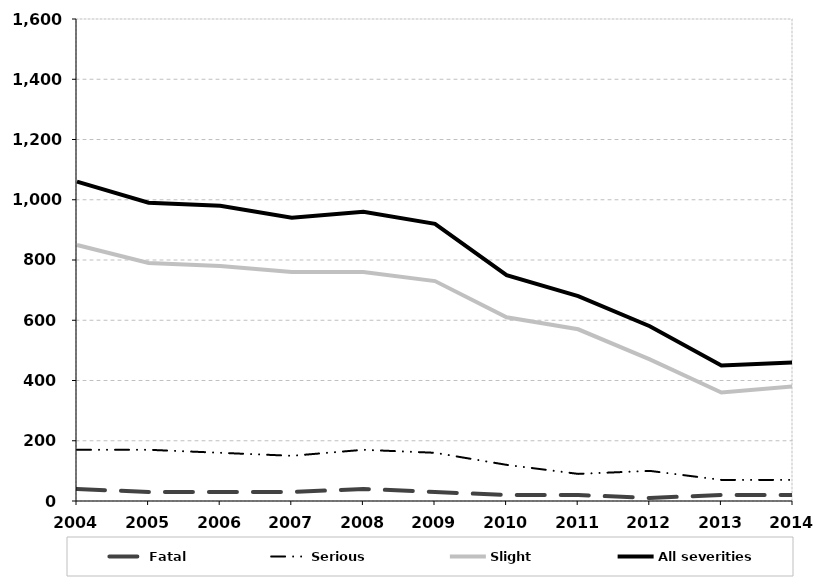
| Category | Fatal | Serious | Slight | All severities |
|---|---|---|---|---|
| 2004.0 | 40 | 170 | 850 | 1060 |
| 2005.0 | 30 | 170 | 790 | 990 |
| 2006.0 | 30 | 160 | 780 | 980 |
| 2007.0 | 30 | 150 | 760 | 940 |
| 2008.0 | 40 | 170 | 760 | 960 |
| 2009.0 | 30 | 160 | 730 | 920 |
| 2010.0 | 20 | 120 | 610 | 750 |
| 2011.0 | 20 | 90 | 570 | 680 |
| 2012.0 | 10 | 100 | 470 | 580 |
| 2013.0 | 20 | 70 | 360 | 450 |
| 2014.0 | 20 | 70 | 380 | 460 |